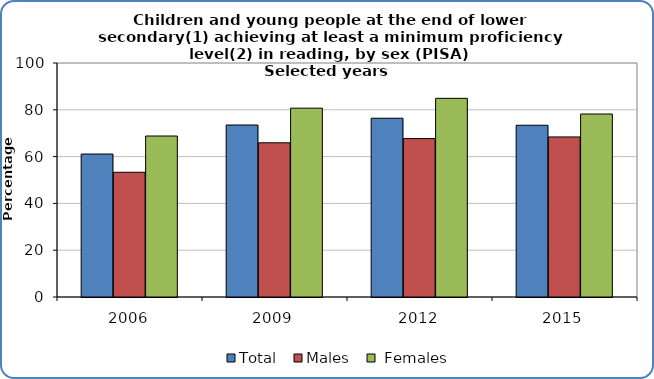
| Category | Total | Males |  Females |
|---|---|---|---|
| 2006.0 | 61.1 | 53.3 | 68.8 |
| 2009.0 | 73.5 | 65.9 | 80.7 |
| 2012.0 | 76.4 | 67.7 | 84.9 |
| 2015.0 | 73.4 | 68.4 | 78.2 |